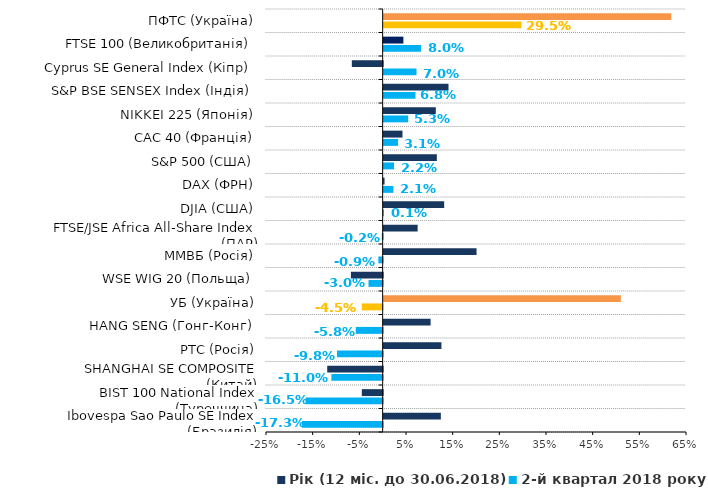
| Category | 2-й квартал 2018 року | Рік (12 міс. до 30.06.2018) |
|---|---|---|
| Ibovespa Sao Paulo SE Index (Бразилія) | -0.173 | 0.123 |
| BIST 100 National Index (Туреччина) | -0.165 | -0.045 |
| SHANGHAI SE COMPOSITE (Китай) | -0.11 | -0.119 |
| РТС (Росія) | -0.098 | 0.124 |
| HANG SENG (Гонг-Конг) | -0.058 | 0.101 |
| УБ (Україна) | -0.045 | 0.508 |
| WSE WIG 20 (Польща) | -0.03 | -0.068 |
| ММВБ (Росія) | -0.009 | 0.199 |
| FTSE/JSE Africa All-Share Index (ПАР) | -0.002 | 0.073 |
| DJIA (США) | 0.001 | 0.13 |
| DAX (ФРН) | 0.021 | 0.002 |
| S&P 500 (США) | 0.022 | 0.114 |
| CAC 40 (Франція) | 0.031 | 0.04 |
| NIKKEI 225 (Японія) | 0.053 | 0.112 |
| S&P BSE SENSEX Index (Індія) | 0.068 | 0.139 |
| Cyprus SE General Index (Кіпр) | 0.07 | -0.066 |
| FTSE 100 (Великобританія) | 0.08 | 0.042 |
| ПФТС (Україна) | 0.295 | 0.616 |